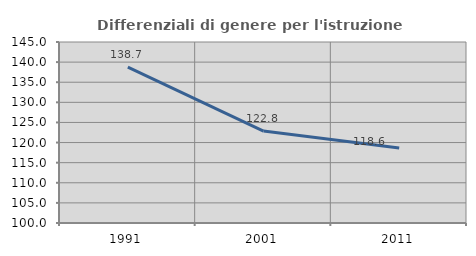
| Category | Differenziali di genere per l'istruzione superiore |
|---|---|
| 1991.0 | 138.73 |
| 2001.0 | 122.847 |
| 2011.0 | 118.618 |